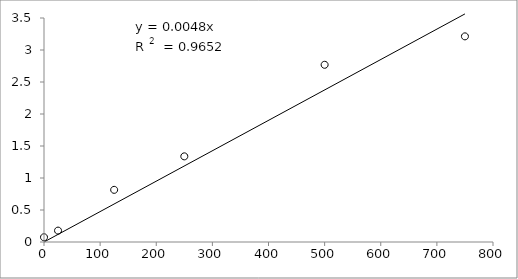
| Category | Series 0 |
|---|---|
| 750.0 | 3.213 |
| 500.0 | 2.769 |
| 250.0 | 1.338 |
| 125.0 | 0.815 |
| 25.0 | 0.178 |
| 0.0 | 0.075 |